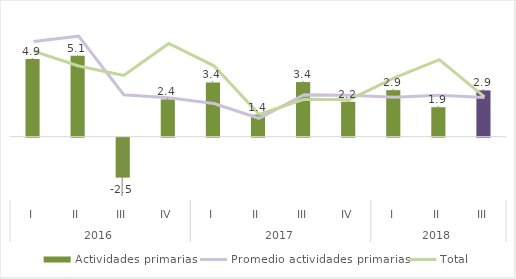
| Category | Actividades primarias |
|---|---|
| 0 | 4.907 |
| 1 | 5.118 |
| 2 | -2.522 |
| 3 | 2.355 |
| 4 | 3.421 |
| 5 | 1.395 |
| 6 | 3.447 |
| 7 | 2.204 |
| 8 | 2.937 |
| 9 | 1.86 |
| 10 | 2.925 |